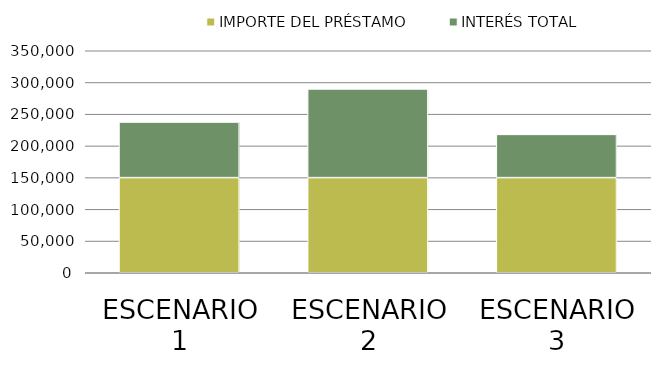
| Category | IMPORTE DEL PRÉSTAMO | INTERÉS TOTAL |
|---|---|---|
| ESCENARIO 1 | 150000 | 87584.066 |
| ESCENARIO 2 | 150000 | 139753.762 |
| ESCENARIO 3 | 150000 | 68152.919 |